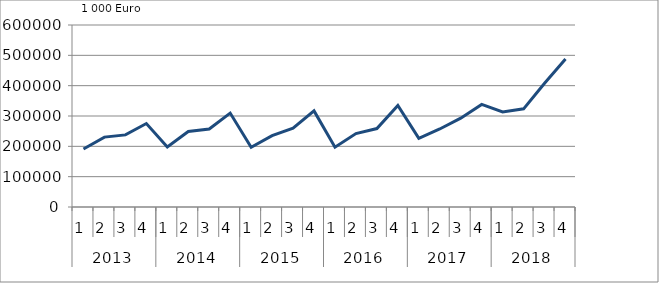
| Category | Ausbaugewerblicher Umsatz3 |
|---|---|
| 0 | 191088.978 |
| 1 | 230353.875 |
| 2 | 237735.574 |
| 3 | 275098.219 |
| 4 | 197732.754 |
| 5 | 248690.349 |
| 6 | 257339.084 |
| 7 | 309632.186 |
| 8 | 197030.42 |
| 9 | 235094.994 |
| 10 | 259758.438 |
| 11 | 316833.232 |
| 12 | 197219.532 |
| 13 | 242069.899 |
| 14 | 258547.84 |
| 15 | 334764.305 |
| 16 | 226552.317 |
| 17 | 257191.13 |
| 18 | 292853.372 |
| 19 | 338154.691 |
| 20 | 313433.569 |
| 21 | 323547.694 |
| 22 | 408057.42 |
| 23 | 487843.765 |